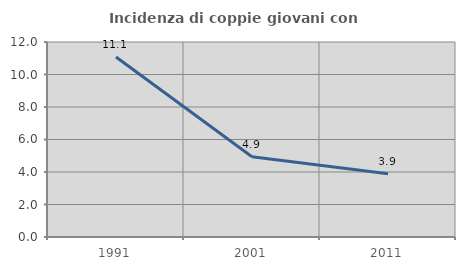
| Category | Incidenza di coppie giovani con figli |
|---|---|
| 1991.0 | 11.073 |
| 2001.0 | 4.943 |
| 2011.0 | 3.896 |